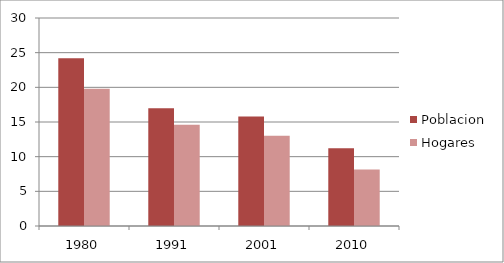
| Category | Poblacion | Hogares |
|---|---|---|
| 1980.0 | 24.2 | 19.8 |
| 1991.0 | 17 | 14.6 |
| 2001.0 | 15.8 | 13 |
| 2010.0 | 11.216 | 8.146 |